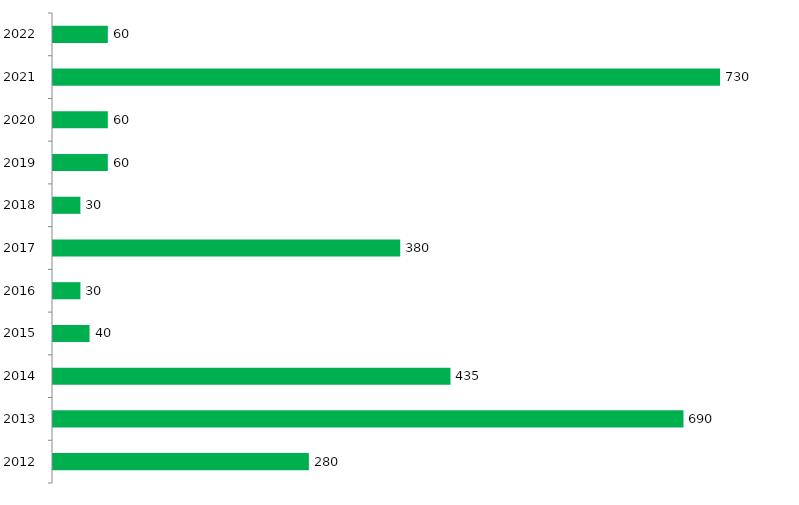
| Category | Series 1 |
|---|---|
| 2012.0 | 280 |
| 2013.0 | 690 |
| 2014.0 | 435 |
| 2015.0 | 40 |
| 2016.0 | 30 |
| 2017.0 | 380 |
| 2018.0 | 30 |
| 2019.0 | 60 |
| 2020.0 | 60 |
| 2021.0 | 730 |
| 2022.0 | 60 |